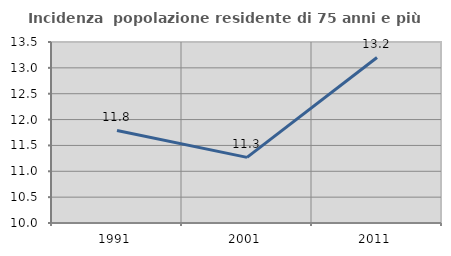
| Category | Incidenza  popolazione residente di 75 anni e più |
|---|---|
| 1991.0 | 11.79 |
| 2001.0 | 11.269 |
| 2011.0 | 13.201 |